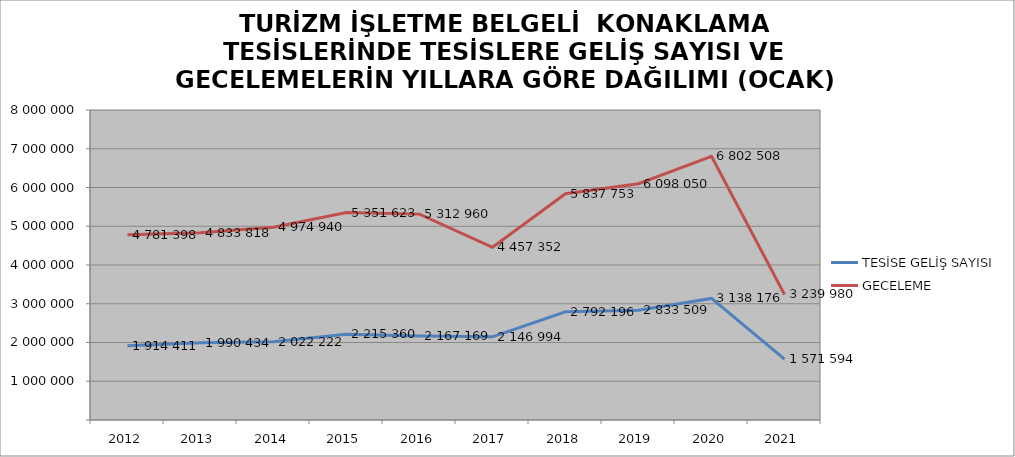
| Category | TESİSE GELİŞ SAYISI | GECELEME |
|---|---|---|
| 2012 | 1914411 | 4781398 |
| 2013 | 1990434 | 4833818 |
| 2014 | 2022222 | 4974940 |
| 2015 | 2215360 | 5351623 |
| 2016 | 2167169 | 5312960 |
| 2017 | 2146994 | 4457352 |
| 2018 | 2792196 | 5837753 |
| 2019 | 2833509 | 6098050 |
| 2020 | 3138176 | 6802508 |
| 2021 | 1571594 | 3239980 |